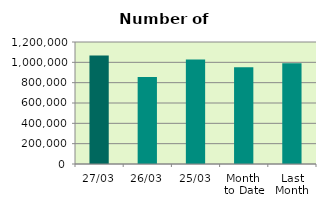
| Category | Series 0 |
|---|---|
| 27/03 | 1066904 |
| 26/03 | 856824 |
| 25/03 | 1026724 |
| Month 
to Date | 952847.579 |
| Last
Month | 989849.1 |